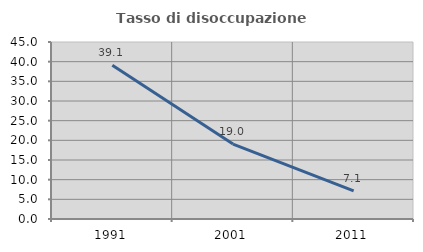
| Category | Tasso di disoccupazione giovanile  |
|---|---|
| 1991.0 | 39.062 |
| 2001.0 | 19.048 |
| 2011.0 | 7.143 |